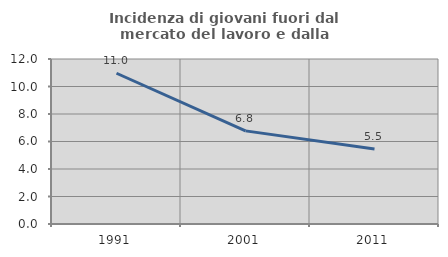
| Category | Incidenza di giovani fuori dal mercato del lavoro e dalla formazione  |
|---|---|
| 1991.0 | 10.963 |
| 2001.0 | 6.773 |
| 2011.0 | 5.455 |